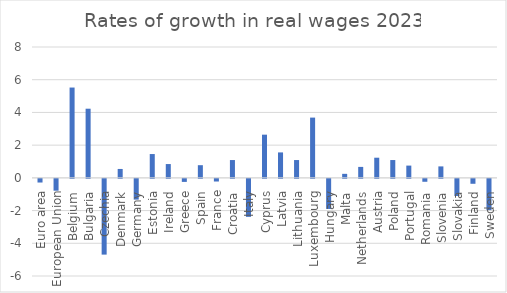
| Category | Series 0 |
|---|---|
| Euro area | -0.224 |
| European Union | -0.724 |
| Belgium | 5.522 |
| Bulgaria | 4.227 |
| Czechia | -4.631 |
| Denmark | 0.544 |
| Germany | -1.268 |
| Estonia | 1.456 |
| Ireland | 0.844 |
| Greece | -0.186 |
| Spain | 0.774 |
| France | -0.162 |
| Croatia | 1.089 |
| Italy | -2.322 |
| Cyprus | 2.64 |
| Latvia | 1.556 |
| Lithuania | 1.089 |
| Luxembourg | 3.684 |
| Hungary | -1.84 |
| Malta | 0.246 |
| Netherlands | 0.67 |
| Austria | 1.232 |
| Poland | 1.089 |
| Portugal | 0.75 |
| Romania | -0.178 |
| Slovenia | 0.701 |
| Slovakia | -1.05 |
| Finland | -0.301 |
| Sweden | -1.91 |